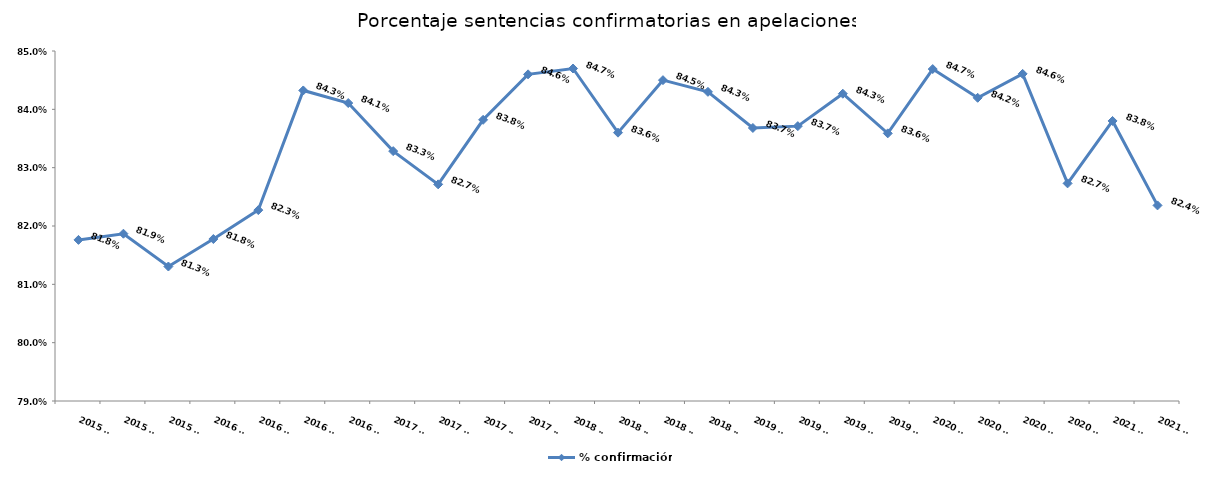
| Category | % confirmación |
|---|---|
| 2015 T2 | 0.818 |
| 2015 T3 | 0.819 |
| 2015 T4 | 0.813 |
| 2016 T1 | 0.818 |
| 2016 T2 | 0.823 |
| 2016 T3 | 0.843 |
| 2016 T4 | 0.841 |
| 2017 T1 | 0.833 |
| 2017 T2 | 0.827 |
| 2017 T3 | 0.838 |
| 2017 T4 | 0.846 |
| 2018 T1 | 0.847 |
| 2018 T2 | 0.836 |
| 2018 T3 | 0.845 |
| 2018 T4 | 0.843 |
| 2019 T1 | 0.837 |
| 2019 T2 | 0.837 |
| 2019 T3 | 0.843 |
| 2019 T4 | 0.836 |
| 2020 T1 | 0.847 |
| 2020 T2 | 0.842 |
| 2020 T3 | 0.846 |
| 2020 T4 | 0.827 |
| 2021 T1 | 0.838 |
| 2021 T2 | 0.824 |